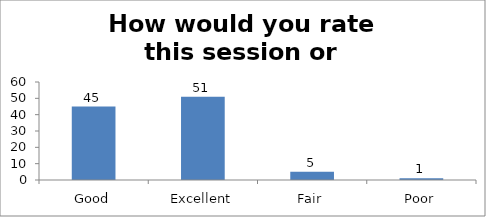
| Category | How would you rate this session or workshop? |
|---|---|
| Good | 45 |
| Excellent | 51 |
| Fair | 5 |
| Poor | 1 |